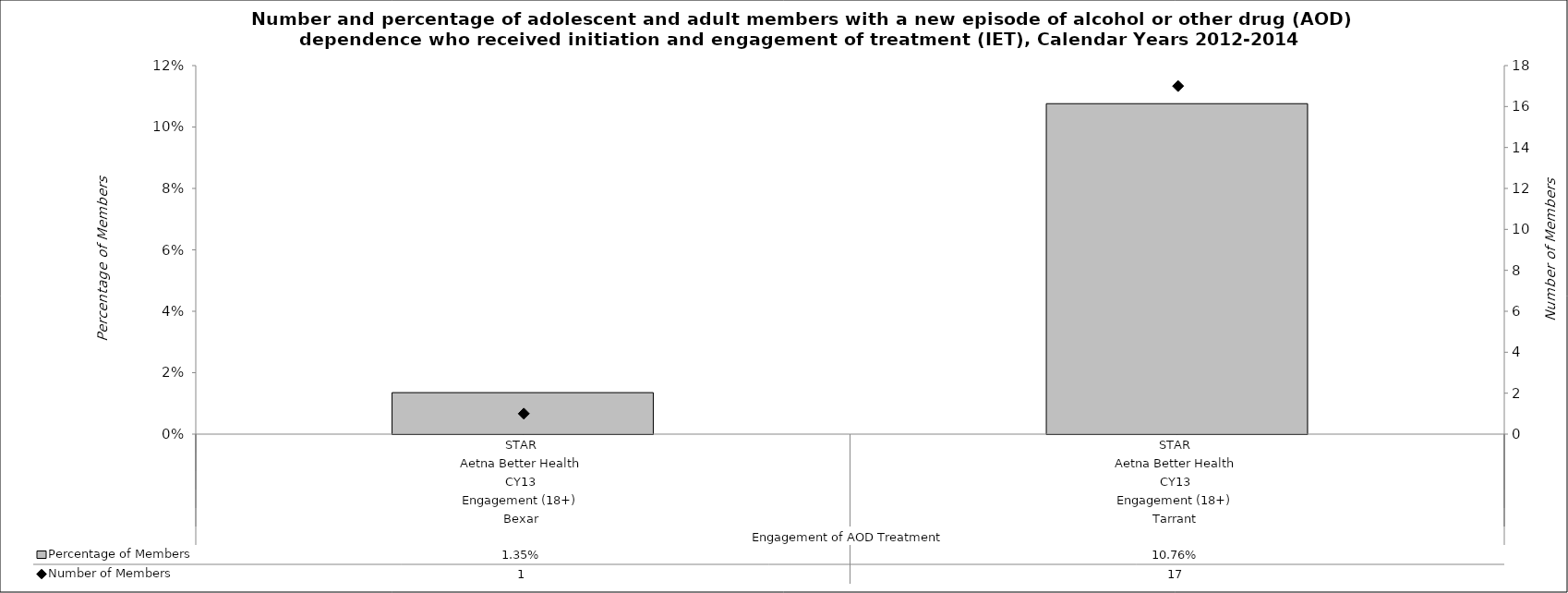
| Category | Percentage of Members |
|---|---|
| 0 | 0.014 |
| 1 | 0.108 |